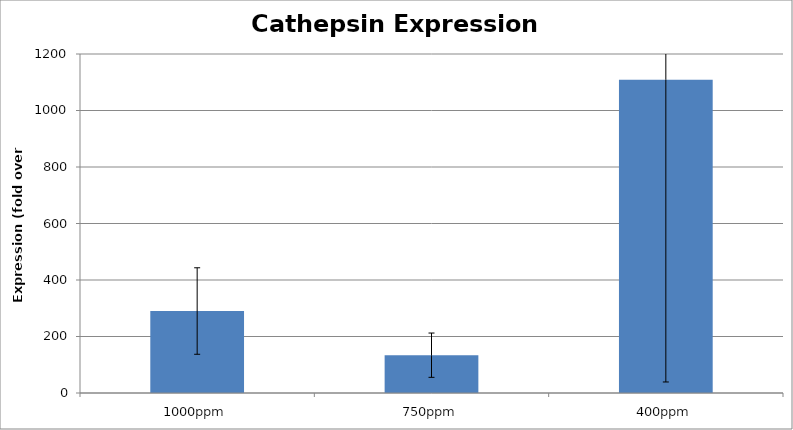
| Category | Series 0 |
|---|---|
| 1000ppm | 290.185 |
| 750ppm | 133.842 |
| 400ppm | 1109.136 |